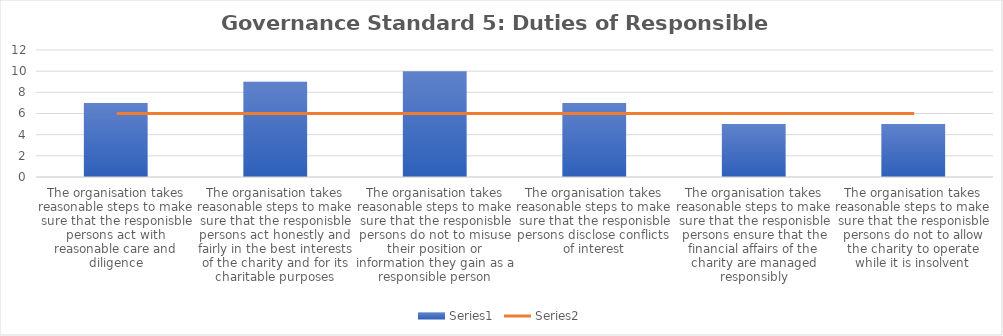
| Category | Series 0 |
|---|---|
| The organisation takes reasonable steps to make sure that the responisble persons act with reasonable care and diligence | 7 |
| The organisation takes reasonable steps to make sure that the responisble persons act honestly and fairly in the best interests of the charity and for its charitable purposes | 9 |
| The organisation takes reasonable steps to make sure that the responisble persons do not to misuse their position or information they gain as a responsible person | 10 |
| The organisation takes reasonable steps to make sure that the responisble persons disclose conflicts of interest | 7 |
| The organisation takes reasonable steps to make sure that the responisble persons ensure that the financial affairs of the charity are managed responsibly | 5 |
| The organisation takes reasonable steps to make sure that the responisble persons do not to allow the charity to operate while it is insolvent | 5 |